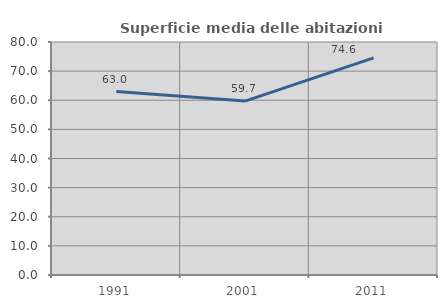
| Category | Superficie media delle abitazioni occupate |
|---|---|
| 1991.0 | 62.973 |
| 2001.0 | 59.71 |
| 2011.0 | 74.568 |